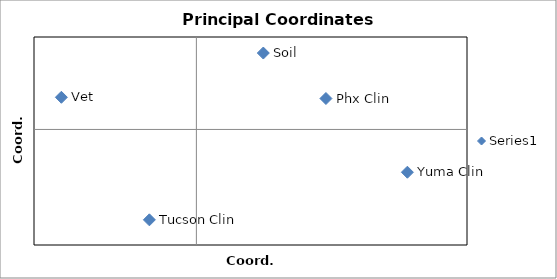
| Category | Series 0 |
|---|---|
| -4.341390409053161 | -7.823 |
| 19.493311256581897 | -3.703 |
| 11.970105327373055 | 2.677 |
| 6.183217517902384 | 6.612 |
| -12.470645382404426 | 2.783 |